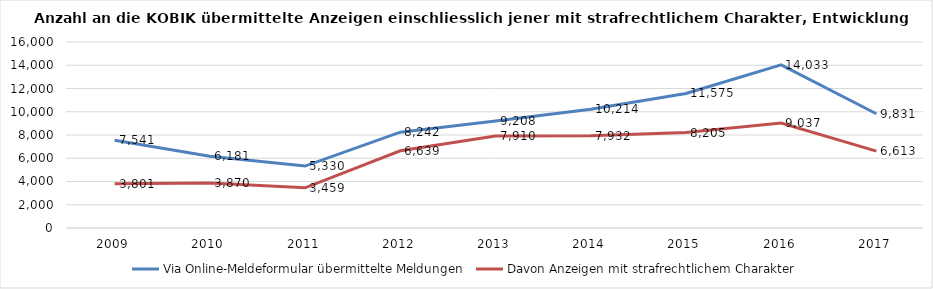
| Category | Via Online-Meldeformular übermittelte Meldungen | Davon Anzeigen mit strafrechtlichem Charakter |
|---|---|---|
| 2009.0 | 7541 | 3801 |
| 2010.0 | 6181 | 3870 |
| 2011.0 | 5330 | 3459 |
| 2012.0 | 8242 | 6639 |
| 2013.0 | 9208 | 7910 |
| 2014.0 | 10214 | 7932 |
| 2015.0 | 11575 | 8205 |
| 2016.0 | 14033 | 9037 |
| 2017.0 | 9831 | 6613 |